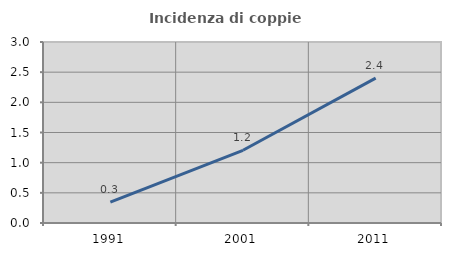
| Category | Incidenza di coppie miste |
|---|---|
| 1991.0 | 0.347 |
| 2001.0 | 1.205 |
| 2011.0 | 2.4 |